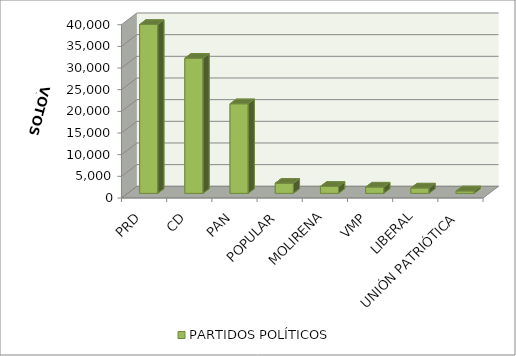
| Category | PARTIDOS POLÍTICOS |
|---|---|
| PRD | 38969 |
| CD | 31187 |
| PAN | 20672 |
| POPULAR | 2337 |
| MOLIRENA | 1594 |
| VMP | 1443 |
| LIBERAL | 1224 |
| UNIÓN PATRIÓTICA | 547 |